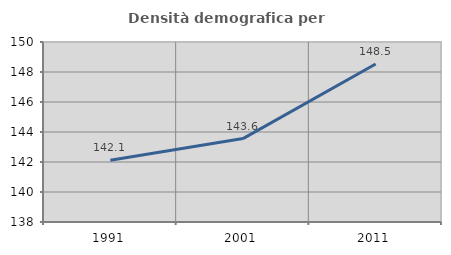
| Category | Densità demografica |
|---|---|
| 1991.0 | 142.111 |
| 2001.0 | 143.562 |
| 2011.0 | 148.53 |